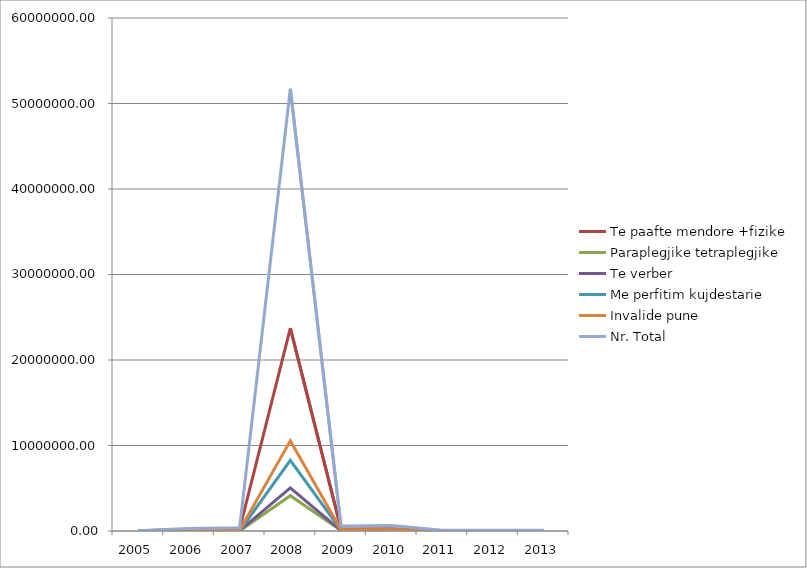
| Category | Te paafte mendore +fizike | Paraplegjike tetraplegjike | Te verber | Me perfitim kujdestarie | Invalide pune | Nr. Total |
|---|---|---|---|---|---|---|
| 2005.0 | 19610.5 | 278.8 | 3769.5 | 3240.5 | 7188.73 | 34088.03 |
| 2006.0 | 213752 | 2796 | 43476 | 43692 | 80773 | 303716 |
| 2007.0 | 244054 | 12095 | 50237 | 7392 | 86187 | 380307 |
| 2008.0 | 23737100 | 4133600 | 5032000 | 8270700 | 10551915 | 51725315 |
| 2009.0 | 243513 | 67662 | 51248 | 93468 | 133146 | 589037 |
| 2010.0 | 263778 | 101191 | 7152 | 112044 | 156349 | 640514 |
| 2011.0 | 28062 | 11058 | 8387 | 11968 | 15756 | 75233 |
| 2012.0 | 32013.8 | 12153.2 | 8636.5 | 12690.8 | 17256 | 82750.3 |
| 2013.0 | 34539.85 | 13311.75 | 8565.75 | 13756.35 | 18823.8 | 89330.5 |